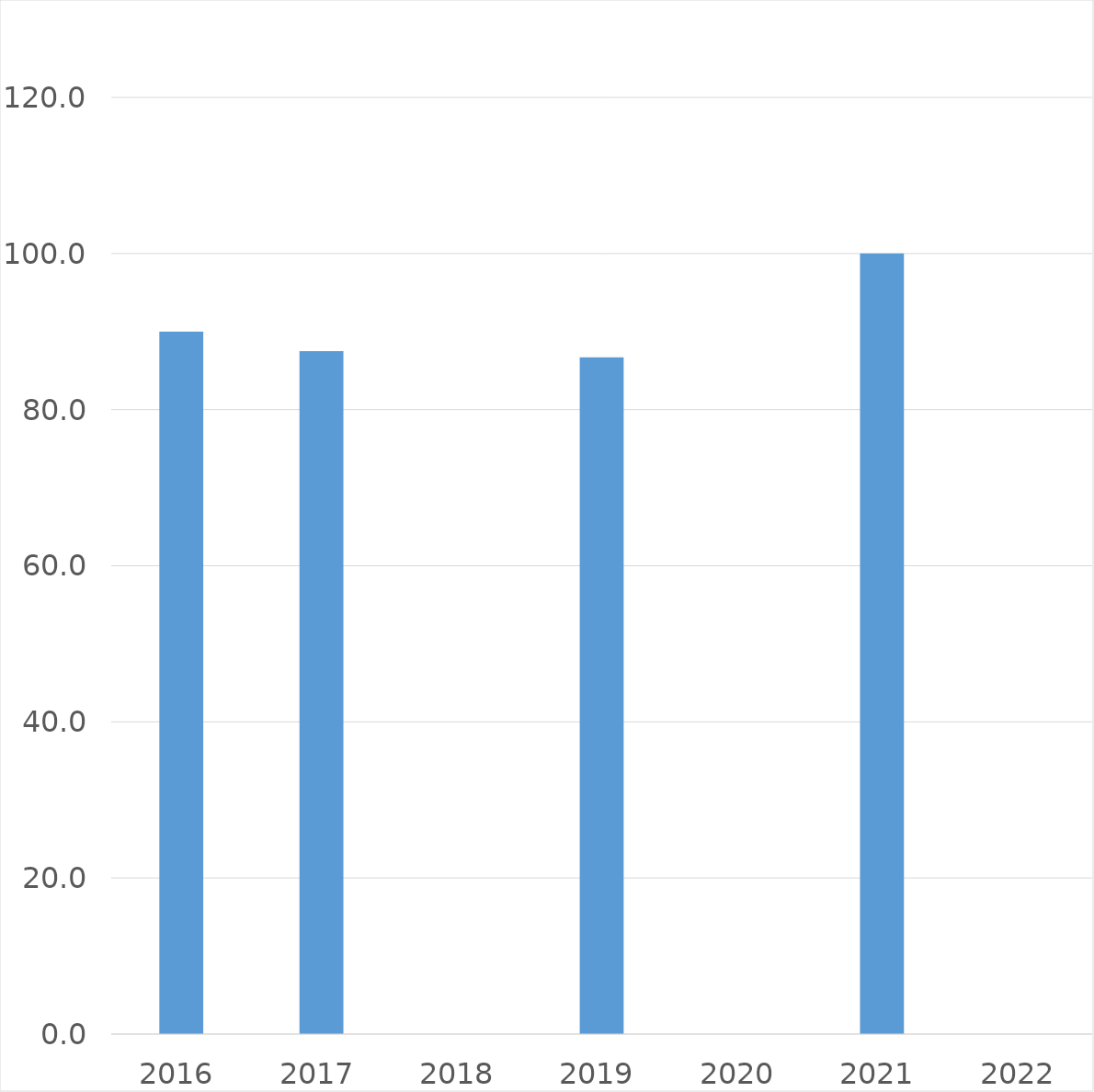
| Category | Series 0 |
|---|---|
| 2016 | 90 |
| 2017 | 87.5 |
| 2018 | 0 |
| 2019 | 86.7 |
| 2020 | 0 |
| 2021 | 100 |
| 2022 | 0 |